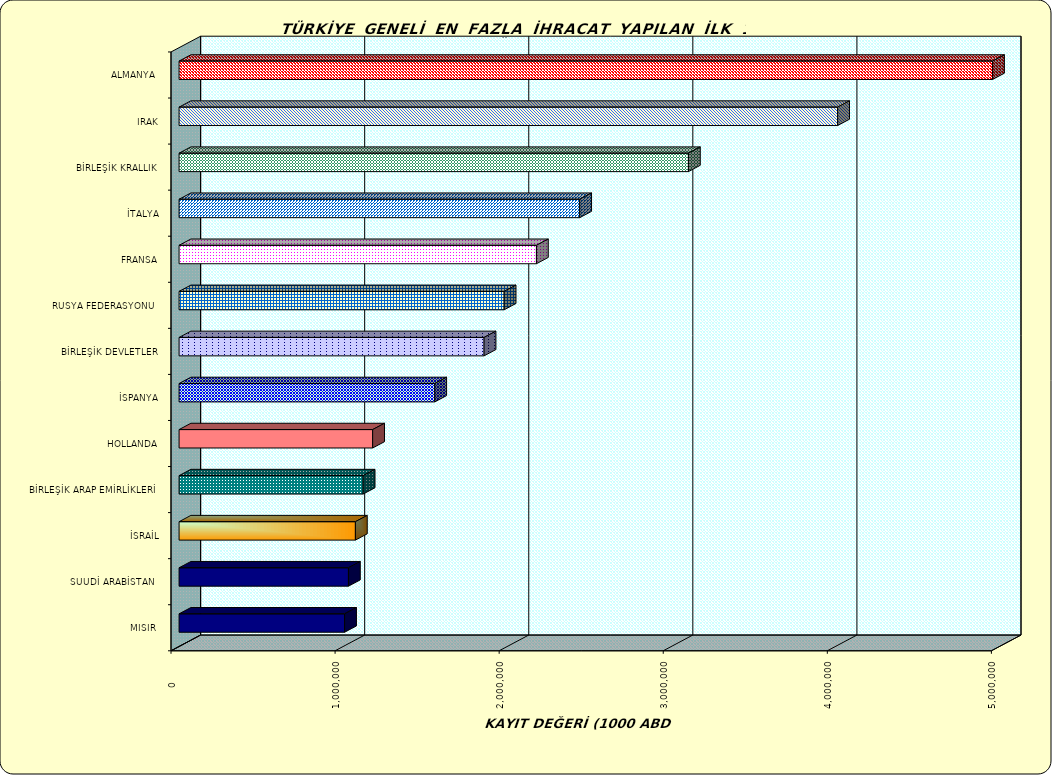
| Category | Series 0 |
|---|---|
| ALMANYA  | 4957916.272 |
| IRAK | 4013787.534 |
| BİRLEŞİK KRALLIK | 3104345.284 |
| İTALYA | 2441582.039 |
| FRANSA | 2178036.318 |
| RUSYA FEDERASYONU  | 1981224.148 |
| BİRLEŞİK DEVLETLER | 1858908.396 |
| İSPANYA | 1558138.411 |
| HOLLANDA | 1179735.533 |
| BİRLEŞİK ARAP EMİRLİKLERİ | 1121984.215 |
| İSRAİL | 1074584.157 |
| SUUDİ ARABİSTAN  | 1032280.054 |
| MISIR  | 1008851.124 |